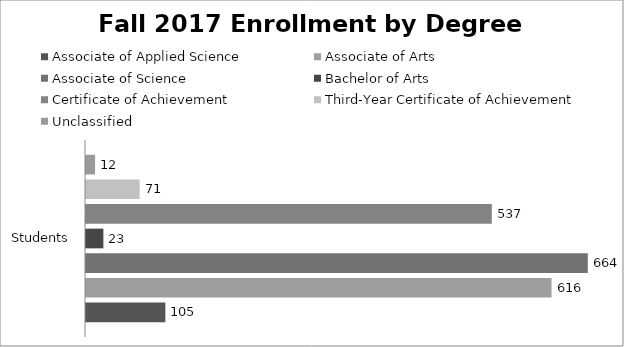
| Category | Associate of Applied Science | Associate of Arts | Associate of Science | Bachelor of Arts | Certificate of Achievement | Third-Year Certificate of Achievement | Unclassified |
|---|---|---|---|---|---|---|---|
| 0 | 105 | 616 | 664 | 23 | 537 | 71 | 12 |